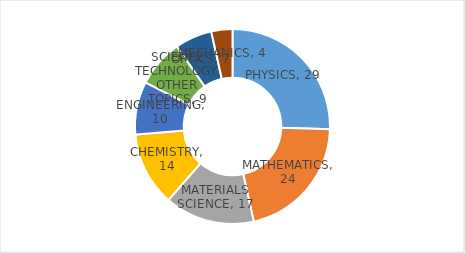
| Category | Series 0 |
|---|---|
| PHYSICS | 29 |
| MATHEMATICS | 24 |
| MATERIALS SCIENCE | 17 |
| CHEMISTRY | 14 |
| ENGINEERING | 10 |
| SCIENCE TECHNOLOGY OTHER TOPICS | 9 |
| OPTICS | 7 |
| MECHANICS | 4 |